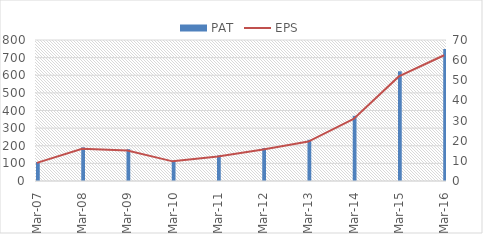
| Category | PAT |
|---|---|
| 2007-03-31 | 107.65 |
| 2008-03-31 | 191 |
| 2009-03-31 | 180.4 |
| 2010-03-31 | 116.51 |
| 2011-03-31 | 145.29 |
| 2012-03-31 | 186.74 |
| 2013-03-31 | 233.87 |
| 2014-03-31 | 369.83 |
| 2015-03-31 | 622.41 |
| 2016-03-31 | 749.09 |